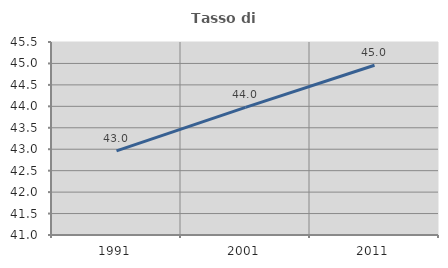
| Category | Tasso di occupazione   |
|---|---|
| 1991.0 | 42.963 |
| 2001.0 | 43.977 |
| 2011.0 | 44.958 |